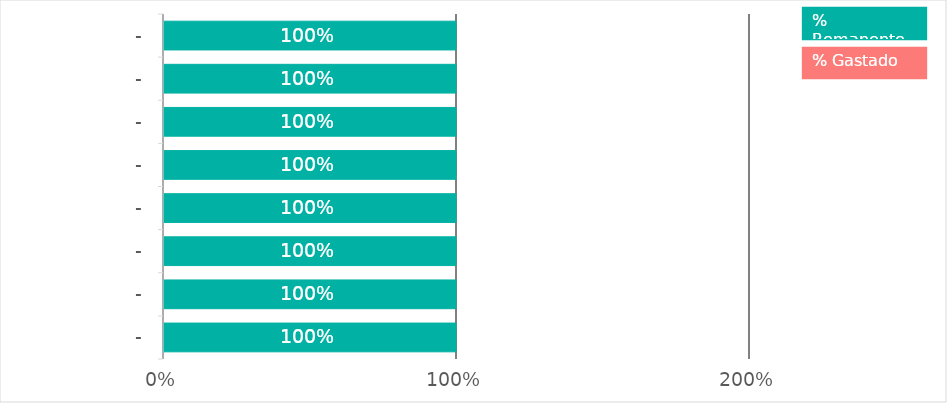
| Category | % Gastado | Presupuesto remanente |
|---|---|---|
| SUPERMERCADO | 0 | 1 |
| GASTOS_FIJOS | 0 | 1 |
| FORMACIÓN | 0 | 1 |
| OCIO | 0 | 1 |
| TRANSPORTE | 0 | 1 |
| VIVIENDA | 0 | 1 |
| SALUD | 0 | 1 |
| STREAMING | 0 | 1 |